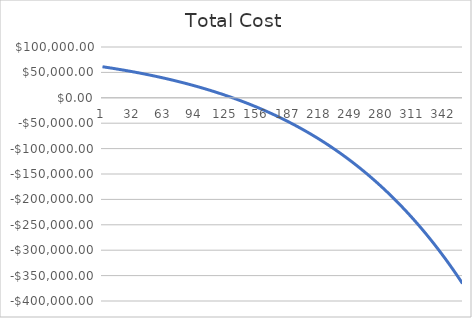
| Category | Series 0 |
|---|---|
| 0 | 61142.466 |
| 1 | 60847.157 |
| 2 | 60549.803 |
| 3 | 60250.392 |
| 4 | 59948.91 |
| 5 | 59645.344 |
| 6 | 59339.681 |
| 7 | 59031.906 |
| 8 | 58722.006 |
| 9 | 58409.967 |
| 10 | 58095.776 |
| 11 | 57779.418 |
| 12 | 57460.879 |
| 13 | 57140.146 |
| 14 | 56817.203 |
| 15 | 56492.038 |
| 16 | 56164.635 |
| 17 | 55834.979 |
| 18 | 55503.058 |
| 19 | 55168.855 |
| 20 | 54832.356 |
| 21 | 54493.546 |
| 22 | 54152.41 |
| 23 | 53808.934 |
| 24 | 53463.102 |
| 25 | 53114.899 |
| 26 | 52764.31 |
| 27 | 52411.319 |
| 28 | 52055.912 |
| 29 | 51698.071 |
| 30 | 51337.783 |
| 31 | 50975.031 |
| 32 | 50609.799 |
| 33 | 50242.071 |
| 34 | 49871.832 |
| 35 | 49499.064 |
| 36 | 49123.753 |
| 37 | 48745.882 |
| 38 | 48365.434 |
| 39 | 47982.392 |
| 40 | 47596.741 |
| 41 | 47208.463 |
| 42 | 46817.542 |
| 43 | 46423.961 |
| 44 | 46027.703 |
| 45 | 45628.75 |
| 46 | 45227.086 |
| 47 | 44822.693 |
| 48 | 44415.554 |
| 49 | 44005.651 |
| 50 | 43592.966 |
| 51 | 43177.483 |
| 52 | 42759.182 |
| 53 | 42338.047 |
| 54 | 41914.059 |
| 55 | 41487.199 |
| 56 | 41057.45 |
| 57 | 40624.794 |
| 58 | 40189.211 |
| 59 | 39750.683 |
| 60 | 39309.192 |
| 61 | 38864.719 |
| 62 | 38417.244 |
| 63 | 37966.749 |
| 64 | 37513.214 |
| 65 | 37056.621 |
| 66 | 36596.95 |
| 67 | 36134.18 |
| 68 | 35668.294 |
| 69 | 35199.271 |
| 70 | 34727.09 |
| 71 | 34251.733 |
| 72 | 33773.179 |
| 73 | 33291.408 |
| 74 | 32806.4 |
| 75 | 32318.133 |
| 76 | 31826.588 |
| 77 | 31331.744 |
| 78 | 30833.58 |
| 79 | 30332.074 |
| 80 | 29827.207 |
| 81 | 29318.957 |
| 82 | 28807.302 |
| 83 | 28292.221 |
| 84 | 27773.692 |
| 85 | 27251.694 |
| 86 | 26726.205 |
| 87 | 26197.203 |
| 88 | 25664.666 |
| 89 | 25128.571 |
| 90 | 24588.897 |
| 91 | 24045.62 |
| 92 | 23498.719 |
| 93 | 22948.17 |
| 94 | 22393.95 |
| 95 | 21836.037 |
| 96 | 21274.407 |
| 97 | 20709.037 |
| 98 | 20139.904 |
| 99 | 19566.983 |
| 100 | 18990.252 |
| 101 | 18409.687 |
| 102 | 17825.262 |
| 103 | 17236.955 |
| 104 | 16644.741 |
| 105 | 16048.595 |
| 106 | 15448.494 |
| 107 | 14844.411 |
| 108 | 14236.323 |
| 109 | 13624.204 |
| 110 | 13008.03 |
| 111 | 12387.774 |
| 112 | 11763.411 |
| 113 | 11134.917 |
| 114 | 10502.264 |
| 115 | 9865.428 |
| 116 | 9224.381 |
| 117 | 8579.099 |
| 118 | 7929.554 |
| 119 | 7275.719 |
| 120 | 6617.569 |
| 121 | 5955.076 |
| 122 | 5288.214 |
| 123 | 4616.955 |
| 124 | 3941.271 |
| 125 | 3261.136 |
| 126 | 2576.522 |
| 127 | 1887.401 |
| 128 | 1193.744 |
| 129 | 495.525 |
| 130 | -207.287 |
| 131 | -914.718 |
| 132 | -1626.798 |
| 133 | -2343.555 |
| 134 | -3065.019 |
| 135 | -3791.219 |
| 136 | -4522.183 |
| 137 | -5257.942 |
| 138 | -5998.525 |
| 139 | -6743.962 |
| 140 | -7494.283 |
| 141 | -8249.518 |
| 142 | -9009.698 |
| 143 | -9774.852 |
| 144 | -10545.013 |
| 145 | -11320.21 |
| 146 | -12100.476 |
| 147 | -12885.84 |
| 148 | -13676.335 |
| 149 | -14471.993 |
| 150 | -15272.844 |
| 151 | -16078.922 |
| 152 | -16890.258 |
| 153 | -17706.885 |
| 154 | -18528.835 |
| 155 | -19356.141 |
| 156 | -20188.836 |
| 157 | -21026.954 |
| 158 | -21870.527 |
| 159 | -22719.589 |
| 160 | -23574.175 |
| 161 | -24434.317 |
| 162 | -25300.05 |
| 163 | -26171.409 |
| 164 | -27048.428 |
| 165 | -27931.142 |
| 166 | -28819.585 |
| 167 | -29713.793 |
| 168 | -30613.801 |
| 169 | -31519.646 |
| 170 | -32431.362 |
| 171 | -33348.985 |
| 172 | -34272.552 |
| 173 | -35202.1 |
| 174 | -36137.664 |
| 175 | -37079.283 |
| 176 | -38026.992 |
| 177 | -38980.829 |
| 178 | -39940.832 |
| 179 | -40907.038 |
| 180 | -41879.485 |
| 181 | -42858.212 |
| 182 | -43843.257 |
| 183 | -44834.658 |
| 184 | -45832.454 |
| 185 | -46836.685 |
| 186 | -47847.389 |
| 187 | -48864.607 |
| 188 | -49888.377 |
| 189 | -50918.74 |
| 190 | -51955.737 |
| 191 | -52999.407 |
| 192 | -54049.791 |
| 193 | -55106.931 |
| 194 | -56170.867 |
| 195 | -57241.64 |
| 196 | -58319.294 |
| 197 | -59403.868 |
| 198 | -60495.406 |
| 199 | -61593.95 |
| 200 | -62699.542 |
| 201 | -63812.226 |
| 202 | -64932.044 |
| 203 | -66059.04 |
| 204 | -67193.257 |
| 205 | -68334.74 |
| 206 | -69483.533 |
| 207 | -70639.679 |
| 208 | -71803.225 |
| 209 | -72974.213 |
| 210 | -74152.691 |
| 211 | -75338.702 |
| 212 | -76532.294 |
| 213 | -77733.511 |
| 214 | -78942.4 |
| 215 | -80159.009 |
| 216 | -81383.382 |
| 217 | -82615.568 |
| 218 | -83855.614 |
| 219 | -85103.567 |
| 220 | -86359.476 |
| 221 | -87623.388 |
| 222 | -88895.352 |
| 223 | -90175.416 |
| 224 | -91463.631 |
| 225 | -92760.044 |
| 226 | -94064.706 |
| 227 | -95377.666 |
| 228 | -96698.974 |
| 229 | -98028.682 |
| 230 | -99366.84 |
| 231 | -100713.498 |
| 232 | -102068.708 |
| 233 | -103432.523 |
| 234 | -104804.993 |
| 235 | -106186.17 |
| 236 | -107576.109 |
| 237 | -108974.86 |
| 238 | -110382.479 |
| 239 | -111799.017 |
| 240 | -113224.529 |
| 241 | -114659.068 |
| 242 | -116102.69 |
| 243 | -117555.449 |
| 244 | -119017.4 |
| 245 | -120488.598 |
| 246 | -121969.098 |
| 247 | -123458.958 |
| 248 | -124958.233 |
| 249 | -126466.981 |
| 250 | -127985.256 |
| 251 | -129513.119 |
| 252 | -131050.625 |
| 253 | -132597.832 |
| 254 | -134154.8 |
| 255 | -135721.587 |
| 256 | -137298.251 |
| 257 | -138884.853 |
| 258 | -140481.451 |
| 259 | -142088.106 |
| 260 | -143704.878 |
| 261 | -145331.827 |
| 262 | -146969.016 |
| 263 | -148616.505 |
| 264 | -150274.356 |
| 265 | -151942.631 |
| 266 | -153621.393 |
| 267 | -155310.704 |
| 268 | -157010.629 |
| 269 | -158721.229 |
| 270 | -160442.57 |
| 271 | -162174.715 |
| 272 | -163917.73 |
| 273 | -165671.679 |
| 274 | -167436.628 |
| 275 | -169212.642 |
| 276 | -170999.788 |
| 277 | -172798.133 |
| 278 | -174607.743 |
| 279 | -176428.685 |
| 280 | -178261.028 |
| 281 | -180104.84 |
| 282 | -181960.189 |
| 283 | -183827.144 |
| 284 | -185705.774 |
| 285 | -187596.149 |
| 286 | -189498.339 |
| 287 | -191412.416 |
| 288 | -193338.448 |
| 289 | -195276.509 |
| 290 | -197226.67 |
| 291 | -199189.003 |
| 292 | -201163.58 |
| 293 | -203150.475 |
| 294 | -205149.76 |
| 295 | -207161.511 |
| 296 | -209185.8 |
| 297 | -211222.704 |
| 298 | -213272.296 |
| 299 | -215334.653 |
| 300 | -217409.851 |
| 301 | -219497.965 |
| 302 | -221599.073 |
| 303 | -223713.253 |
| 304 | -225840.581 |
| 305 | -227981.137 |
| 306 | -230134.998 |
| 307 | -232302.245 |
| 308 | -234482.956 |
| 309 | -236677.212 |
| 310 | -238885.093 |
| 311 | -241106.68 |
| 312 | -243342.054 |
| 313 | -245591.298 |
| 314 | -247854.494 |
| 315 | -250131.724 |
| 316 | -252423.072 |
| 317 | -254728.622 |
| 318 | -257048.459 |
| 319 | -259382.666 |
| 320 | -261731.329 |
| 321 | -264094.534 |
| 322 | -266472.367 |
| 323 | -268864.915 |
| 324 | -271272.265 |
| 325 | -273694.505 |
| 326 | -276131.722 |
| 327 | -278584.007 |
| 328 | -281051.448 |
| 329 | -283534.134 |
| 330 | -286032.157 |
| 331 | -288545.607 |
| 332 | -291074.575 |
| 333 | -293619.153 |
| 334 | -296179.434 |
| 335 | -298755.51 |
| 336 | -301347.475 |
| 337 | -303955.423 |
| 338 | -306579.449 |
| 339 | -309219.647 |
| 340 | -311876.113 |
| 341 | -314548.944 |
| 342 | -317238.235 |
| 343 | -319944.085 |
| 344 | -322666.591 |
| 345 | -325405.851 |
| 346 | -328161.965 |
| 347 | -330935.032 |
| 348 | -333725.152 |
| 349 | -336532.426 |
| 350 | -339356.954 |
| 351 | -342198.84 |
| 352 | -345058.185 |
| 353 | -347935.092 |
| 354 | -350829.666 |
| 355 | -353742.009 |
| 356 | -356672.227 |
| 357 | -359620.426 |
| 358 | -362586.71 |
| 359 | -365571.188 |